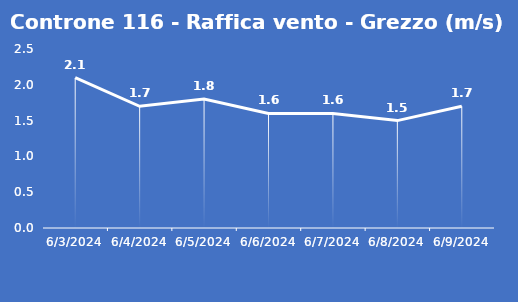
| Category | Controne 116 - Raffica vento - Grezzo (m/s) |
|---|---|
| 6/3/24 | 2.1 |
| 6/4/24 | 1.7 |
| 6/5/24 | 1.8 |
| 6/6/24 | 1.6 |
| 6/7/24 | 1.6 |
| 6/8/24 | 1.5 |
| 6/9/24 | 1.7 |